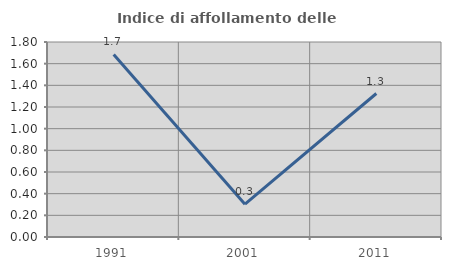
| Category | Indice di affollamento delle abitazioni  |
|---|---|
| 1991.0 | 1.685 |
| 2001.0 | 0.303 |
| 2011.0 | 1.325 |